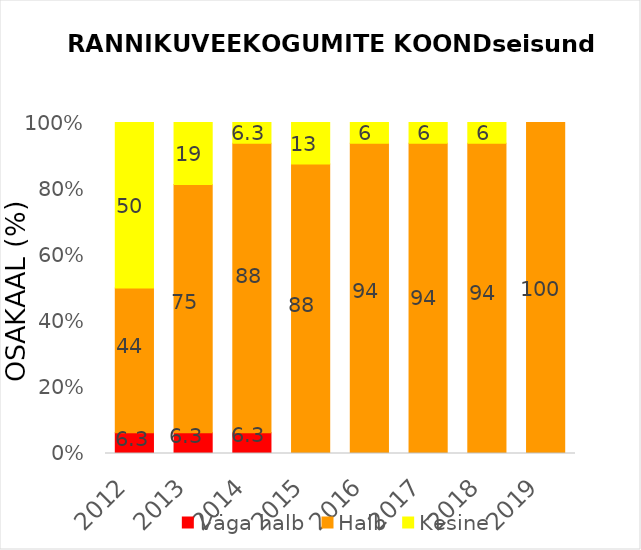
| Category | Väga halb | Halb | Kesine |
|---|---|---|---|
| 2012.0 | 6.25 | 43.75 | 50 |
| 2013.0 | 6.25 | 75 | 18.75 |
| 2014.0 | 6.25 | 87.5 | 6.25 |
| 2015.0 | 0 | 87.5 | 12.5 |
| 2016.0 | 0 | 93.75 | 6.25 |
| 2017.0 | 0 | 93.75 | 6.25 |
| 2018.0 | 0 | 93.75 | 6.25 |
| 2019.0 | 0 | 100 | 0 |